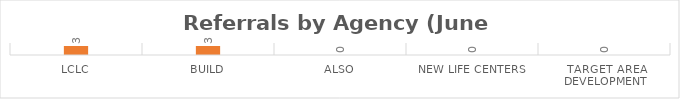
| Category | Series 0 |
|---|---|
| LCLC | 3 |
| BUILD | 3 |
| ALSO | 0 |
| New Life Centers | 0 |
| Target Area Development | 0 |